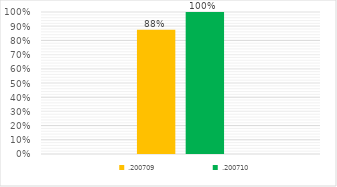
| Category | .200709 | .200710 |
|---|---|---|
| 0 | 0.875 | 1 |